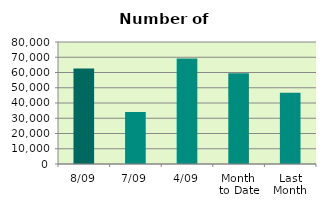
| Category | Series 0 |
|---|---|
| 8/09 | 62648 |
| 7/09 | 34042 |
| 4/09 | 69150 |
| Month 
to Date | 59482.333 |
| Last
Month | 46763.238 |